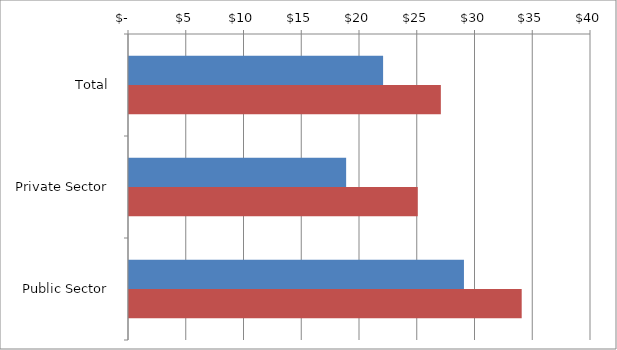
| Category | Series 0 | Series 1 |
|---|---|---|
| Total | 22 | 27 |
|  Private Sector  | 18.8 | 25 |
|  Public Sector  | 29 | 34 |